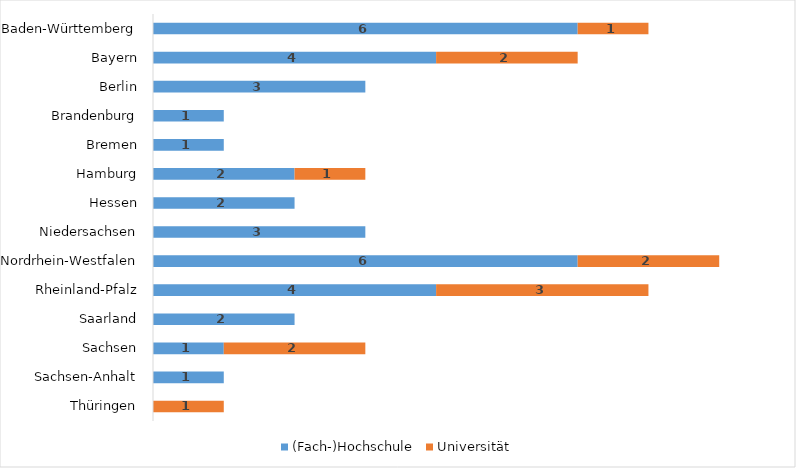
| Category | (Fach-)Hochschule | Universität |
|---|---|---|
| Thüringen | 0 | 1 |
| Sachsen-Anhalt | 1 | 0 |
| Sachsen | 1 | 2 |
| Saarland | 2 | 0 |
| Rheinland-Pfalz | 4 | 3 |
| Nordrhein-Westfalen | 6 | 2 |
| Niedersachsen | 3 | 0 |
| Hessen | 2 | 0 |
| Hamburg | 2 | 1 |
| Bremen | 1 | 0 |
| Brandenburg | 1 | 0 |
| Berlin | 3 | 0 |
| Bayern | 4 | 2 |
| Baden-Württemberg | 6 | 1 |